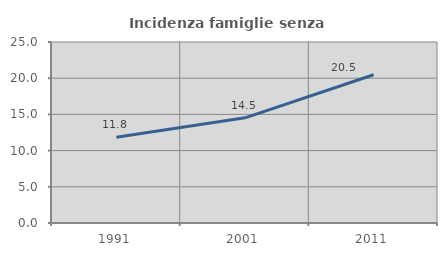
| Category | Incidenza famiglie senza nuclei |
|---|---|
| 1991.0 | 11.835 |
| 2001.0 | 14.526 |
| 2011.0 | 20.481 |